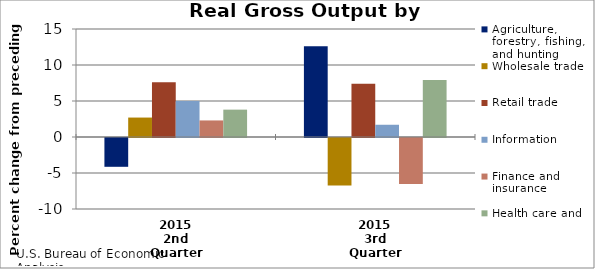
| Category | Agriculture, forestry, fishing, and hunting | Wholesale trade | Retail trade | Information | Finance and insurance | Health care and social assistance |
|---|---|---|---|---|---|---|
| 2015
2nd Quarter | -4 | 2.7 | 7.6 | 5 | 2.3 | 3.8 |
| 2015
3rd Quarter | 12.6 | -6.6 | 7.4 | 1.7 | -6.4 | 7.9 |